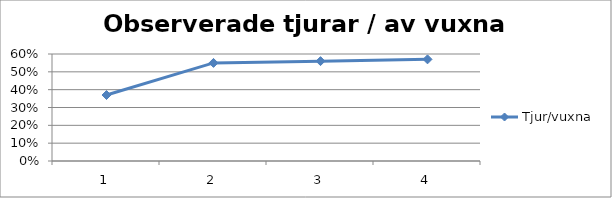
| Category | Tjur/vuxna |
|---|---|
| 0 | 0.37 |
| 1 | 0.55 |
| 2 | 0.56 |
| 3 | 0.57 |